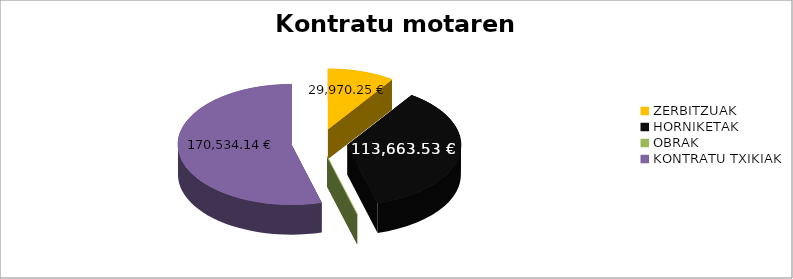
| Category | Kontratu motaren arabera |
|---|---|
| ZERBITZUAK | 29970.25 |
| HORNIKETAK | 113663.53 |
| OBRAK | 0 |
| KONTRATU TXIKIAK | 170534.14 |